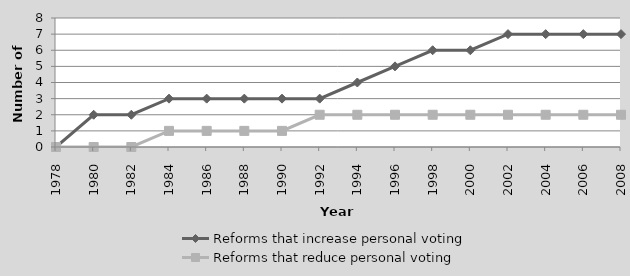
| Category | Reforms that increase personal voting | Reforms that reduce personal voting |
|---|---|---|
| 1978.0 | 0 | 0 |
| 1980.0 | 2 | 0 |
| 1982.0 | 2 | 0 |
| 1984.0 | 3 | 1 |
| 1986.0 | 3 | 1 |
| 1988.0 | 3 | 1 |
| 1990.0 | 3 | 1 |
| 1992.0 | 3 | 2 |
| 1994.0 | 4 | 2 |
| 1996.0 | 5 | 2 |
| 1998.0 | 6 | 2 |
| 2000.0 | 6 | 2 |
| 2002.0 | 7 | 2 |
| 2004.0 | 7 | 2 |
| 2006.0 | 7 | 2 |
| 2008.0 | 7 | 2 |